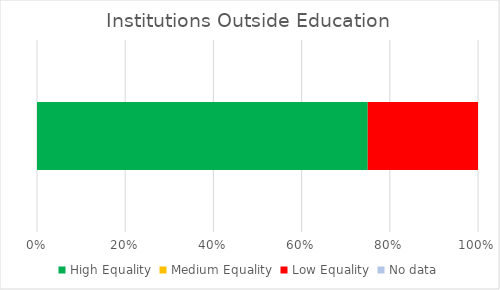
| Category | High Equality | Medium Equality | Low Equality | No data |
|---|---|---|---|---|
| 0 | 3 | 0 | 1 | 0 |